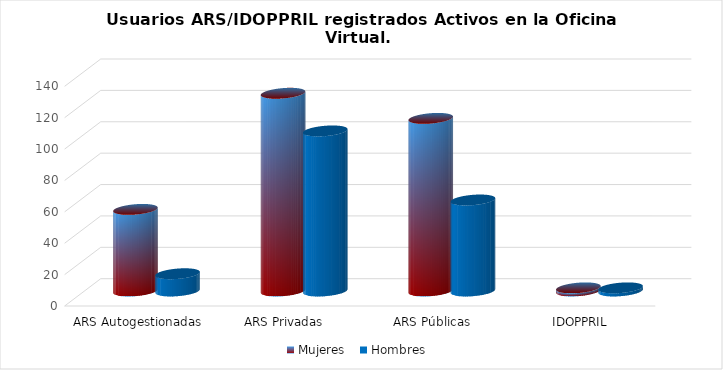
| Category | Mujeres | Hombres |
|---|---|---|
| ARS Autogestionadas | 52 | 11 |
| ARS Privadas | 126 | 102 |
| ARS Públicas | 110 | 58 |
| IDOPPRIL | 2 | 2 |